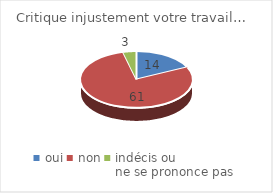
| Category | Critique injustement votre travail… |
|---|---|
| oui | 14 |
| non | 61 |
| indécis ou 
ne se prononce pas | 3 |